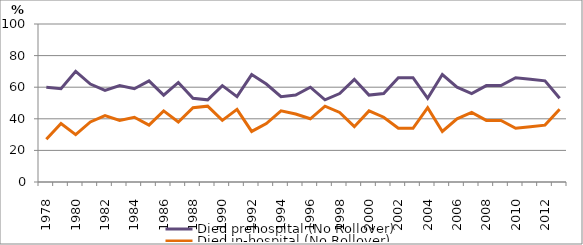
| Category | Died prehospital (No Rollover) | Died in-hospital (No Rollover) |
|---|---|---|
| 1978.0 | 60 | 27 |
| 1979.0 | 59 | 37 |
| 1980.0 | 70 | 30 |
| 1981.0 | 62 | 38 |
| 1982.0 | 58 | 42 |
| 1983.0 | 61 | 39 |
| 1984.0 | 59 | 41 |
| 1985.0 | 64 | 36 |
| 1986.0 | 55 | 45 |
| 1987.0 | 63 | 38 |
| 1988.0 | 53 | 47 |
| 1989.0 | 52 | 48 |
| 1990.0 | 61 | 39 |
| 1991.0 | 54 | 46 |
| 1992.0 | 68 | 32 |
| 1993.0 | 62 | 37 |
| 1994.0 | 54 | 45 |
| 1995.0 | 55 | 43 |
| 1996.0 | 60 | 40 |
| 1997.0 | 52 | 48 |
| 1998.0 | 56 | 44 |
| 1999.0 | 65 | 35 |
| 2000.0 | 55 | 45 |
| 2001.0 | 56 | 41 |
| 2002.0 | 66 | 34 |
| 2003.0 | 66 | 34 |
| 2004.0 | 53 | 47 |
| 2005.0 | 68 | 32 |
| 2006.0 | 60 | 40 |
| 2007.0 | 56 | 44 |
| 2008.0 | 61 | 39 |
| 2009.0 | 61 | 39 |
| 2010.0 | 66 | 34 |
| 2011.0 | 65 | 35 |
| 2012.0 | 64 | 36 |
| 2013.0 | 53 | 46 |